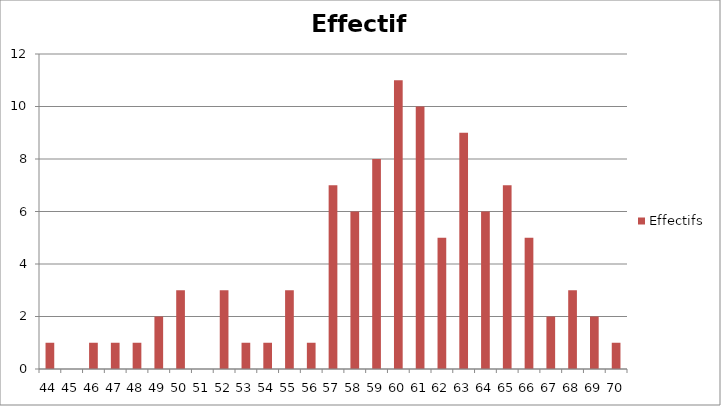
| Category | Effectifs |
|---|---|
| 44.0 | 1 |
| 45.0 | 0 |
| 46.0 | 1 |
| 47.0 | 1 |
| 48.0 | 1 |
| 49.0 | 2 |
| 50.0 | 3 |
| 51.0 | 0 |
| 52.0 | 3 |
| 53.0 | 1 |
| 54.0 | 1 |
| 55.0 | 3 |
| 56.0 | 1 |
| 57.0 | 7 |
| 58.0 | 6 |
| 59.0 | 8 |
| 60.0 | 11 |
| 61.0 | 10 |
| 62.0 | 5 |
| 63.0 | 9 |
| 64.0 | 6 |
| 65.0 | 7 |
| 66.0 | 5 |
| 67.0 | 2 |
| 68.0 | 3 |
| 69.0 | 2 |
| 70.0 | 1 |